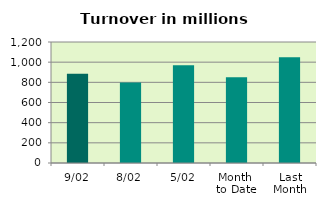
| Category | Series 0 |
|---|---|
| 9/02 | 885.634 |
| 8/02 | 797.324 |
| 5/02 | 968.878 |
| Month 
to Date | 849.421 |
| Last
Month | 1049.647 |